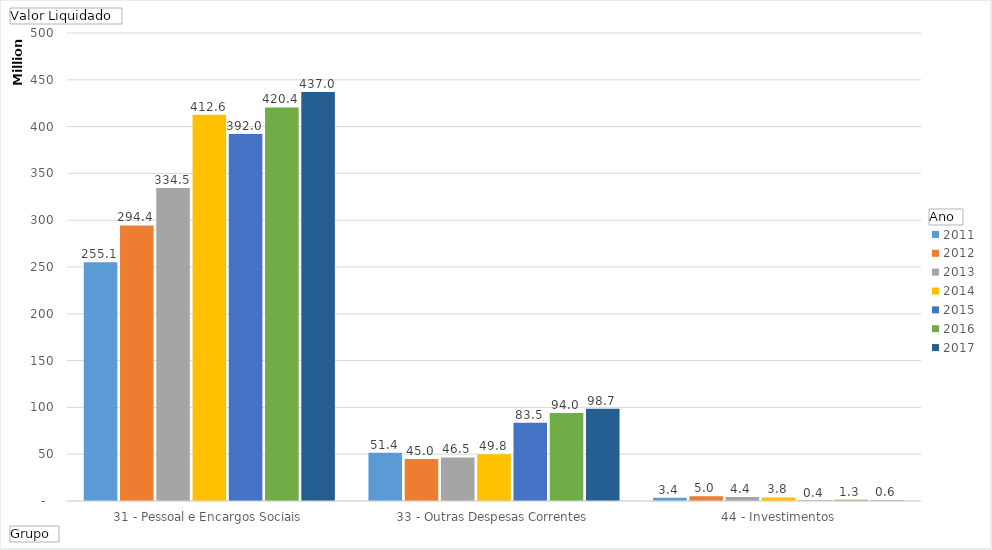
| Category | 2011 | 2012 | 2013 | 2014 | 2015 | 2016 | 2017 |
|---|---|---|---|---|---|---|---|
| 31 - Pessoal e Encargos Sociais | 255109061.75 | 294400430.53 | 334464066.5 | 412587048.52 | 392022552.43 | 420441127.71 | 436992172.17 |
| 33 - Outras Despesas Correntes | 51449536.5 | 44984062.98 | 46548575.58 | 49843932.7 | 83549268.91 | 93969953 | 98674569.04 |
| 44 - Investimentos | 3399677.9 | 5017922.99 | 4385587.66 | 3847705.54 | 427107.95 | 1327095.49 | 628013.87 |